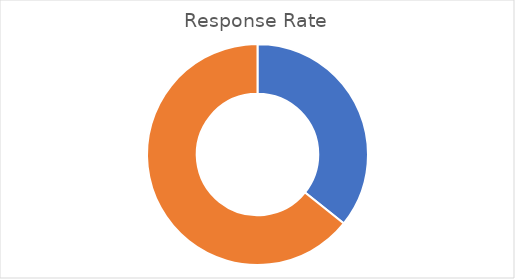
| Category | Total |
|---|---|
| Sum of OverallRespRate | 35.73 |
| Sum of OverallNonRespRate | 64.27 |